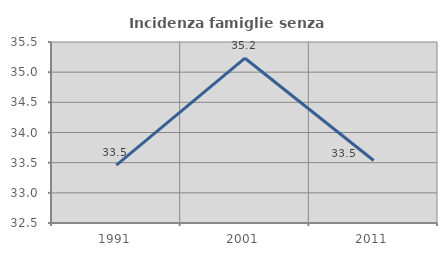
| Category | Incidenza famiglie senza nuclei |
|---|---|
| 1991.0 | 33.46 |
| 2001.0 | 35.231 |
| 2011.0 | 33.537 |